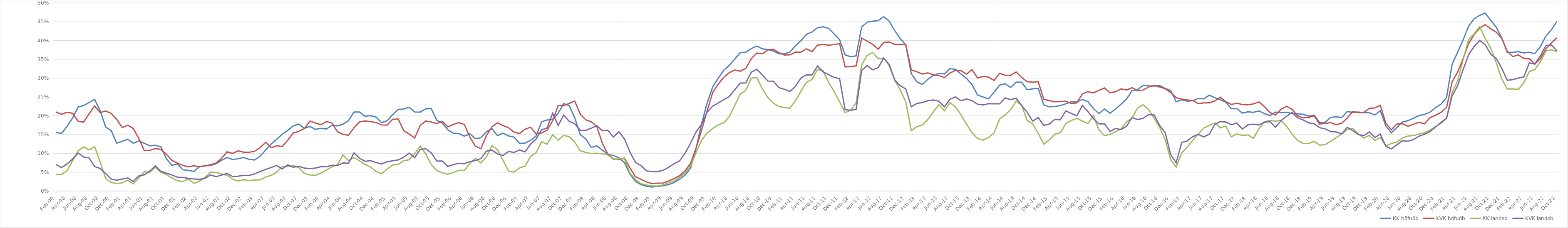
| Category | KK höfuðb | KVK höfuðb | KK landsb | KVK landsb |
|---|---|---|---|---|
| feb.00 | 0.156 | 0.21 | 0.043 | 0.07 |
| mar.00 | 0.153 | 0.204 | 0.044 | 0.062 |
| apr.00 | 0.172 | 0.209 | 0.054 | 0.072 |
| maí.00 | 0.194 | 0.206 | 0.081 | 0.085 |
| jún.00 | 0.223 | 0.186 | 0.107 | 0.101 |
| júl.00 | 0.227 | 0.183 | 0.117 | 0.09 |
| ágú.00 | 0.235 | 0.205 | 0.109 | 0.088 |
| sep.00 | 0.244 | 0.226 | 0.118 | 0.065 |
| okt.00 | 0.213 | 0.209 | 0.077 | 0.06 |
| nóv.00 | 0.17 | 0.213 | 0.033 | 0.046 |
| des.00 | 0.16 | 0.206 | 0.023 | 0.032 |
| jan.01 | 0.127 | 0.191 | 0.02 | 0.029 |
| feb.01 | 0.132 | 0.169 | 0.022 | 0.032 |
| mar.01 | 0.138 | 0.175 | 0.029 | 0.035 |
| apr.01 | 0.127 | 0.166 | 0.019 | 0.025 |
| maí.01 | 0.133 | 0.14 | 0.034 | 0.04 |
| jún.01 | 0.127 | 0.107 | 0.051 | 0.043 |
| júl.01 | 0.12 | 0.108 | 0.05 | 0.053 |
| ágú.01 | 0.122 | 0.113 | 0.063 | 0.067 |
| sep.01 | 0.118 | 0.111 | 0.05 | 0.052 |
| okt.01 | 0.086 | 0.098 | 0.044 | 0.047 |
| nóv.01 | 0.068 | 0.081 | 0.035 | 0.043 |
| des.01 | 0.072 | 0.074 | 0.027 | 0.037 |
| jan.02 | 0.056 | 0.068 | 0.026 | 0.036 |
| feb.02 | 0.055 | 0.064 | 0.032 | 0.034 |
| mar.02 | 0.052 | 0.067 | 0.02 | 0.032 |
| apr.02 | 0.065 | 0.064 | 0.026 | 0.031 |
| maí.02 | 0.067 | 0.067 | 0.037 | 0.034 |
| jún.02 | 0.068 | 0.07 | 0.05 | 0.043 |
| júl.02 | 0.073 | 0.074 | 0.05 | 0.038 |
| ágú.02 | 0.082 | 0.087 | 0.045 | 0.042 |
| sep.02 | 0.089 | 0.104 | 0.042 | 0.047 |
| okt.02 | 0.084 | 0.1 | 0.031 | 0.038 |
| nóv.02 | 0.086 | 0.107 | 0.027 | 0.039 |
| des.02 | 0.089 | 0.103 | 0.03 | 0.042 |
| jan.03 | 0.084 | 0.103 | 0.028 | 0.042 |
| feb.03 | 0.083 | 0.106 | 0.029 | 0.046 |
| mar.03 | 0.093 | 0.116 | 0.03 | 0.052 |
| apr.03 | 0.109 | 0.129 | 0.037 | 0.058 |
| maí.03 | 0.125 | 0.115 | 0.042 | 0.062 |
| jún.03 | 0.138 | 0.12 | 0.05 | 0.068 |
| júl.03 | 0.151 | 0.118 | 0.065 | 0.059 |
| ágú.03 | 0.161 | 0.135 | 0.066 | 0.069 |
| sep.03 | 0.173 | 0.154 | 0.068 | 0.063 |
| okt.03 | 0.178 | 0.159 | 0.062 | 0.066 |
| nóv.03 | 0.167 | 0.166 | 0.047 | 0.061 |
| des.03 | 0.172 | 0.186 | 0.043 | 0.06 |
| jan.04 | 0.164 | 0.181 | 0.042 | 0.061 |
| feb.04 | 0.167 | 0.176 | 0.048 | 0.064 |
| mar.04 | 0.165 | 0.185 | 0.056 | 0.065 |
| apr.04 | 0.175 | 0.181 | 0.064 | 0.068 |
| maí.04 | 0.173 | 0.158 | 0.07 | 0.068 |
| jún.04 | 0.178 | 0.151 | 0.096 | 0.075 |
| júl.04 | 0.187 | 0.148 | 0.081 | 0.074 |
| ágú.04 | 0.21 | 0.168 | 0.089 | 0.101 |
| sep.04 | 0.21 | 0.184 | 0.08 | 0.087 |
| okt.04 | 0.199 | 0.186 | 0.071 | 0.079 |
| nóv.04 | 0.2 | 0.185 | 0.064 | 0.081 |
| des.04 | 0.197 | 0.182 | 0.052 | 0.076 |
| jan.05 | 0.182 | 0.176 | 0.046 | 0.072 |
| feb.05 | 0.187 | 0.175 | 0.059 | 0.078 |
| mar.05 | 0.203 | 0.191 | 0.069 | 0.08 |
| apr.05 | 0.217 | 0.191 | 0.07 | 0.083 |
| maí.05 | 0.218 | 0.161 | 0.081 | 0.09 |
| jún.05 | 0.223 | 0.151 | 0.083 | 0.101 |
| júl.05 | 0.21 | 0.141 | 0.099 | 0.089 |
| ágú.05 | 0.21 | 0.174 | 0.119 | 0.111 |
| sep.05 | 0.219 | 0.186 | 0.099 | 0.112 |
| okt.05 | 0.219 | 0.184 | 0.071 | 0.102 |
| nóv.05 | 0.188 | 0.179 | 0.054 | 0.08 |
| des.05 | 0.181 | 0.185 | 0.048 | 0.08 |
| jan.06 | 0.163 | 0.171 | 0.045 | 0.065 |
| feb.06 | 0.154 | 0.177 | 0.049 | 0.07 |
| mar.06 | 0.153 | 0.182 | 0.055 | 0.074 |
| apr.06 | 0.146 | 0.177 | 0.055 | 0.072 |
| maí.06 | 0.152 | 0.143 | 0.074 | 0.078 |
| jún.06 | 0.139 | 0.119 | 0.087 | 0.081 |
| júl.06 | 0.142 | 0.113 | 0.075 | 0.086 |
| ágú.06 | 0.158 | 0.147 | 0.091 | 0.106 |
| sep.06 | 0.166 | 0.171 | 0.121 | 0.109 |
| okt.06 | 0.147 | 0.181 | 0.11 | 0.099 |
| nóv.06 | 0.154 | 0.174 | 0.082 | 0.094 |
| des.06 | 0.147 | 0.168 | 0.053 | 0.105 |
| jan.07 | 0.143 | 0.157 | 0.05 | 0.103 |
| feb.07 | 0.127 | 0.153 | 0.061 | 0.109 |
| mar.07 | 0.127 | 0.164 | 0.066 | 0.104 |
| apr.07 | 0.135 | 0.169 | 0.092 | 0.125 |
| maí.07 | 0.146 | 0.152 | 0.102 | 0.138 |
| jún.07 | 0.184 | 0.155 | 0.131 | 0.162 |
| júl.07 | 0.189 | 0.161 | 0.124 | 0.168 |
| ágú.07 | 0.191 | 0.187 | 0.15 | 0.207 |
| sep.07 | 0.207 | 0.227 | 0.136 | 0.174 |
| okt.07 | 0.232 | 0.227 | 0.148 | 0.202 |
| nóv.07 | 0.227 | 0.233 | 0.144 | 0.186 |
| des.07 | 0.195 | 0.239 | 0.13 | 0.179 |
| jan.08 | 0.15 | 0.204 | 0.107 | 0.162 |
| feb.08 | 0.139 | 0.189 | 0.103 | 0.161 |
| mar.08 | 0.116 | 0.184 | 0.099 | 0.167 |
| apr.08 | 0.12 | 0.172 | 0.101 | 0.174 |
| maí.08 | 0.109 | 0.127 | 0.099 | 0.16 |
| jún.08 | 0.098 | 0.098 | 0.096 | 0.162 |
| júl.08 | 0.094 | 0.085 | 0.084 | 0.144 |
| ágú.08 | 0.089 | 0.083 | 0.085 | 0.158 |
| sep.08 | 0.076 | 0.088 | 0.086 | 0.139 |
| okt.08 | 0.045 | 0.062 | 0.048 | 0.104 |
| nóv.08 | 0.026 | 0.038 | 0.03 | 0.076 |
| des.08 | 0.017 | 0.031 | 0.02 | 0.068 |
| jan.09 | 0.013 | 0.024 | 0.016 | 0.054 |
| feb.09 | 0.011 | 0.02 | 0.014 | 0.052 |
| mar.09 | 0.012 | 0.021 | 0.013 | 0.052 |
| apr.09 | 0.014 | 0.021 | 0.016 | 0.055 |
| maí.09 | 0.017 | 0.027 | 0.022 | 0.063 |
| jún.09 | 0.023 | 0.033 | 0.027 | 0.073 |
| júl.09 | 0.031 | 0.041 | 0.036 | 0.08 |
| ágú.09 | 0.043 | 0.053 | 0.048 | 0.1 |
| sep.09 | 0.061 | 0.074 | 0.067 | 0.127 |
| okt.09 | 0.114 | 0.115 | 0.102 | 0.157 |
| nóv.09 | 0.179 | 0.162 | 0.135 | 0.177 |
| des.09 | 0.234 | 0.213 | 0.154 | 0.21 |
| jan.10 | 0.277 | 0.262 | 0.166 | 0.226 |
| feb.10 | 0.3 | 0.284 | 0.176 | 0.234 |
| mar.10 | 0.321 | 0.302 | 0.182 | 0.243 |
| apr.10 | 0.334 | 0.315 | 0.198 | 0.251 |
| maí.10 | 0.351 | 0.322 | 0.227 | 0.269 |
| jún.10 | 0.368 | 0.319 | 0.258 | 0.287 |
| júl.10 | 0.369 | 0.326 | 0.267 | 0.287 |
| ágú.10 | 0.379 | 0.352 | 0.3 | 0.316 |
| sep.10 | 0.385 | 0.367 | 0.302 | 0.324 |
| okt.10 | 0.378 | 0.365 | 0.272 | 0.309 |
| nóv.10 | 0.376 | 0.375 | 0.248 | 0.293 |
| des.10 | 0.372 | 0.377 | 0.233 | 0.292 |
| jan.11 | 0.365 | 0.368 | 0.225 | 0.275 |
| feb.11 | 0.365 | 0.362 | 0.222 | 0.271 |
| mar.11 | 0.369 | 0.362 | 0.22 | 0.265 |
| apr.11 | 0.386 | 0.369 | 0.24 | 0.278 |
| maí.11 | 0.4 | 0.369 | 0.265 | 0.301 |
| jún.11 | 0.417 | 0.378 | 0.289 | 0.309 |
| júl.11 | 0.423 | 0.37 | 0.297 | 0.308 |
| ágú.11 | 0.434 | 0.388 | 0.323 | 0.332 |
| sep.11 | 0.436 | 0.39 | 0.32 | 0.317 |
| okt.11 | 0.432 | 0.388 | 0.289 | 0.309 |
| nóv.11 | 0.418 | 0.389 | 0.265 | 0.302 |
| des.11 | 0.402 | 0.392 | 0.238 | 0.299 |
| jan.12 | 0.362 | 0.33 | 0.209 | 0.216 |
| feb.12 | 0.357 | 0.331 | 0.215 | 0.215 |
| mar.12 | 0.359 | 0.333 | 0.234 | 0.217 |
| apr.12 | 0.436 | 0.407 | 0.336 | 0.321 |
| maí.12 | 0.449 | 0.398 | 0.361 | 0.333 |
| jún.12 | 0.451 | 0.39 | 0.368 | 0.322 |
| júl.12 | 0.453 | 0.377 | 0.352 | 0.328 |
| ágú.12 | 0.463 | 0.395 | 0.354 | 0.354 |
| sep.12 | 0.452 | 0.396 | 0.333 | 0.336 |
| okt.12 | 0.426 | 0.389 | 0.294 | 0.295 |
| nóv.12 | 0.405 | 0.39 | 0.269 | 0.28 |
| des.12 | 0.388 | 0.389 | 0.237 | 0.272 |
| jan.13 | 0.312 | 0.322 | 0.161 | 0.224 |
| feb.13 | 0.29 | 0.317 | 0.171 | 0.233 |
| mar.13 | 0.283 | 0.311 | 0.176 | 0.235 |
| apr.13 | 0.297 | 0.314 | 0.19 | 0.24 |
| maí.13 | 0.307 | 0.309 | 0.211 | 0.242 |
| jún.13 | 0.313 | 0.307 | 0.229 | 0.239 |
| júl.13 | 0.311 | 0.301 | 0.214 | 0.224 |
| ágú.13 | 0.325 | 0.314 | 0.235 | 0.244 |
| sep.13 | 0.323 | 0.321 | 0.224 | 0.25 |
| okt.13 | 0.311 | 0.32 | 0.203 | 0.24 |
| nóv.13 | 0.3 | 0.311 | 0.178 | 0.245 |
| des.13 | 0.283 | 0.323 | 0.155 | 0.24 |
| jan.14 | 0.255 | 0.301 | 0.139 | 0.231 |
| feb.14 | 0.25 | 0.305 | 0.135 | 0.229 |
| mar.14 | 0.245 | 0.303 | 0.142 | 0.232 |
| apr.14 | 0.262 | 0.294 | 0.154 | 0.232 |
| maí.14 | 0.281 | 0.313 | 0.191 | 0.232 |
| jún.14 | 0.285 | 0.308 | 0.202 | 0.248 |
| júl.14 | 0.275 | 0.308 | 0.216 | 0.243 |
| ágú.14 | 0.289 | 0.316 | 0.239 | 0.247 |
| sep.14 | 0.289 | 0.302 | 0.227 | 0.228 |
| okt.14 | 0.269 | 0.291 | 0.188 | 0.209 |
| nóv.14 | 0.272 | 0.289 | 0.178 | 0.186 |
| des.14 | 0.273 | 0.29 | 0.153 | 0.195 |
| jan.15 | 0.229 | 0.244 | 0.125 | 0.174 |
| feb.15 | 0.224 | 0.24 | 0.136 | 0.178 |
| mar.15 | 0.225 | 0.237 | 0.151 | 0.19 |
| apr.15 | 0.227 | 0.238 | 0.155 | 0.189 |
| maí.15 | 0.232 | 0.239 | 0.179 | 0.213 |
| jún.15 | 0.237 | 0.232 | 0.188 | 0.206 |
| júl.15 | 0.236 | 0.234 | 0.193 | 0.2 |
| ágú.15 | 0.244 | 0.258 | 0.186 | 0.228 |
| sep.15 | 0.238 | 0.264 | 0.18 | 0.211 |
| okt.15 | 0.219 | 0.261 | 0.201 | 0.192 |
| nóv.15 | 0.206 | 0.268 | 0.163 | 0.178 |
| des.15 | 0.218 | 0.274 | 0.147 | 0.179 |
| jan.16 | 0.207 | 0.261 | 0.151 | 0.158 |
| feb.16 | 0.218 | 0.264 | 0.158 | 0.166 |
| mar.16 | 0.231 | 0.272 | 0.165 | 0.163 |
| apr.16 | 0.244 | 0.269 | 0.183 | 0.172 |
| maí.16 | 0.267 | 0.275 | 0.194 | 0.195 |
| jún.16 | 0.269 | 0.267 | 0.22 | 0.19 |
| júl.16 | 0.281 | 0.268 | 0.229 | 0.193 |
| ágú.16 | 0.28 | 0.276 | 0.217 | 0.203 |
| sep.16 | 0.279 | 0.281 | 0.193 | 0.202 |
| okt.16 | 0.28 | 0.277 | 0.169 | 0.174 |
| nóv.16 | 0.273 | 0.272 | 0.137 | 0.156 |
| des.16 | 0.267 | 0.262 | 0.084 | 0.097 |
| jan.17 | 0.237 | 0.248 | 0.064 | 0.075 |
| feb.17 | 0.243 | 0.244 | 0.101 | 0.129 |
| mar.17 | 0.239 | 0.242 | 0.117 | 0.133 |
| apr.17 | 0.24 | 0.241 | 0.135 | 0.144 |
| maí.17 | 0.246 | 0.233 | 0.151 | 0.151 |
| jún.17 | 0.245 | 0.234 | 0.167 | 0.144 |
| júl.17 | 0.255 | 0.234 | 0.174 | 0.151 |
| ágú.17 | 0.248 | 0.239 | 0.181 | 0.177 |
| sep.17 | 0.243 | 0.249 | 0.168 | 0.184 |
| okt.17 | 0.236 | 0.237 | 0.173 | 0.183 |
| nóv.17 | 0.219 | 0.23 | 0.144 | 0.176 |
| des.17 | 0.219 | 0.233 | 0.152 | 0.181 |
| jan.18 | 0.207 | 0.23 | 0.148 | 0.165 |
| feb.18 | 0.21 | 0.229 | 0.149 | 0.176 |
| mar.18 | 0.209 | 0.232 | 0.14 | 0.178 |
| apr.18 | 0.213 | 0.237 | 0.166 | 0.176 |
| maí.18 | 0.206 | 0.224 | 0.184 | 0.183 |
| jún.18 | 0.201 | 0.209 | 0.188 | 0.185 |
| júl.18 | 0.21 | 0.202 | 0.186 | 0.169 |
| ágú.18 | 0.209 | 0.217 | 0.188 | 0.187 |
| sep.18 | 0.21 | 0.225 | 0.172 | 0.199 |
| okt.18 | 0.206 | 0.217 | 0.152 | 0.209 |
| nóv.18 | 0.205 | 0.199 | 0.134 | 0.194 |
| des.18 | 0.204 | 0.195 | 0.127 | 0.189 |
| jan.19 | 0.199 | 0.195 | 0.126 | 0.181 |
| feb.19 | 0.202 | 0.2 | 0.132 | 0.179 |
| mar.19 | 0.182 | 0.178 | 0.122 | 0.168 |
| apr.19 | 0.183 | 0.18 | 0.123 | 0.165 |
| maí.19 | 0.196 | 0.182 | 0.132 | 0.158 |
| jún.19 | 0.197 | 0.176 | 0.142 | 0.157 |
| júl.19 | 0.195 | 0.18 | 0.151 | 0.152 |
| ágú.19 | 0.211 | 0.194 | 0.163 | 0.169 |
| sep.19 | 0.209 | 0.211 | 0.167 | 0.161 |
| okt.19 | 0.21 | 0.209 | 0.152 | 0.15 |
| nóv.19 | 0.208 | 0.209 | 0.141 | 0.147 |
| des.19 | 0.208 | 0.22 | 0.148 | 0.157 |
| jan.20 | 0.202 | 0.221 | 0.134 | 0.142 |
| feb.20 | 0.213 | 0.228 | 0.143 | 0.151 |
| mars.20* | 0.173 | 0.18 | 0.12 | 0.119 |
| apr.20 | 0.155 | 0.163 | 0.126 | 0.112 |
| maí.20 | 0.169 | 0.178 | 0.13 | 0.123 |
| jún.20 | 0.183 | 0.179 | 0.141 | 0.134 |
| júl.20 | 0.187 | 0.172 | 0.146 | 0.132 |
| ágú.20 | 0.194 | 0.178 | 0.147 | 0.137 |
| sep.20 | 0.201 | 0.183 | 0.151 | 0.146 |
| okt.20 | 0.204 | 0.179 | 0.155 | 0.151 |
| nóv.20 | 0.21 | 0.195 | 0.162 | 0.158 |
| des.20 | 0.221 | 0.202 | 0.171 | 0.17 |
| jan.21 | 0.231 | 0.209 | 0.18 | 0.183 |
| feb.21 | 0.248 | 0.222 | 0.193 | 0.193 |
| mar.21 | 0.337 | 0.29 | 0.262 | 0.253 |
| apr.21 | 0.369 | 0.316 | 0.292 | 0.279 |
| maí.21 | 0.402 | 0.352 | 0.349 | 0.323 |
| jún.21 | 0.438 | 0.392 | 0.403 | 0.362 |
| júl.21 | 0.458 | 0.416 | 0.418 | 0.384 |
| ágú.21 | 0.467 | 0.433 | 0.437 | 0.4 |
| sep.21 | 0.473 | 0.443 | 0.406 | 0.389 |
| okt.21 | 0.454 | 0.431 | 0.38 | 0.364 |
| nóv.21 | 0.435 | 0.422 | 0.341 | 0.352 |
| des.21 | 0.407 | 0.406 | 0.298 | 0.326 |
| jan.22 | 0.369 | 0.371 | 0.271 | 0.294 |
| feb.22 | 0.369 | 0.357 | 0.271 | 0.296 |
| mar.22 | 0.37 | 0.362 | 0.27 | 0.3 |
| apr.22 | 0.367 | 0.353 | 0.288 | 0.303 |
| maí.22 | 0.369 | 0.352 | 0.318 | 0.341 |
| jún.22 | 0.365 | 0.338 | 0.323 | 0.337 |
| júl.22 | 0.384 | 0.352 | 0.343 | 0.359 |
| ágú.22 | 0.412 | 0.377 | 0.372 | 0.386 |
| sep.22 | 0.429 | 0.394 | 0.375 | 0.389 |
| okt.22 | 0.451 | 0.407 | 0.37 | 0.372 |